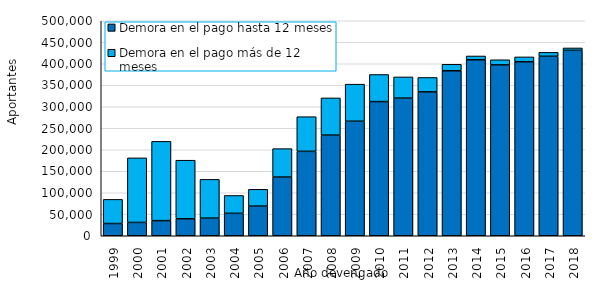
| Category | Demora en el pago hasta 12 meses | Demora en el pago más de 12 meses |
|---|---|---|
| 1999.0 | 28465 | 56142 |
| 2000.0 | 31003 | 150138 |
| 2001.0 | 35168 | 184372 |
| 2002.0 | 39441 | 136258 |
| 2003.0 | 40989 | 90177 |
| 2004.0 | 52174 | 41516 |
| 2005.0 | 69016 | 38972 |
| 2006.0 | 136501 | 66131 |
| 2007.0 | 196361 | 80546 |
| 2008.0 | 234033 | 86515 |
| 2009.0 | 266322 | 86229 |
| 2010.0 | 311997 | 63028 |
| 2011.0 | 320064 | 49322 |
| 2012.0 | 334657 | 33463 |
| 2013.0 | 383649 | 15144 |
| 2014.0 | 409267 | 8797 |
| 2015.0 | 397387 | 11876 |
| 2016.0 | 404689 | 11250 |
| 2017.0 | 417386 | 9127 |
| 2018.0 | 431215 | 5545 |